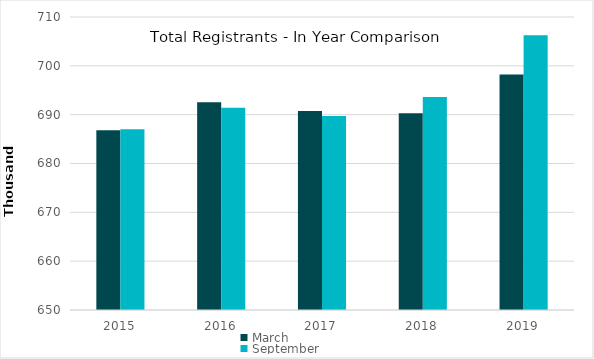
| Category | March | September |
|---|---|---|
| 2015.0 | 686811 | 687001 |
| 2016.0 | 692556 | 691416 |
| 2017.0 | 690773 | 689738 |
| 2018.0 | 690278 | 693618 |
| 2019.0 | 698237 | 706252 |